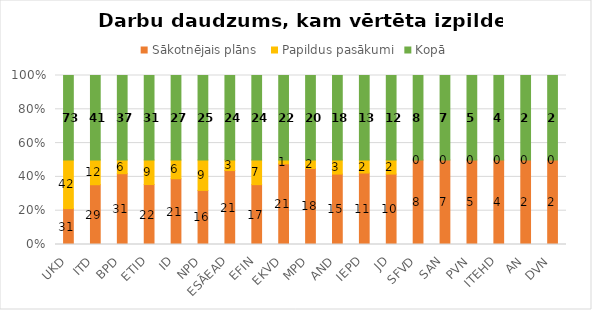
| Category | Sākotnējais plāns  | Papildus pasākumi | Kopā |
|---|---|---|---|
| UKD | 31 | 42 | 73 |
| ITD | 29 | 12 | 41 |
| BPD | 31 | 6 | 37 |
| ETID | 22 | 9 | 31 |
| ID | 21 | 6 | 27 |
| NPD | 16 | 9 | 25 |
| ESĀEAD | 21 | 3 | 24 |
| EFIN | 17 | 7 | 24 |
| EKVD | 21 | 1 | 22 |
| MPD | 18 | 2 | 20 |
| AND | 15 | 3 | 18 |
| IEPD | 11 | 2 | 13 |
| JD | 10 | 2 | 12 |
| SFVD | 8 | 0 | 8 |
| SAN | 7 | 0 | 7 |
| PVN | 5 | 0 | 5 |
| ITEHD | 4 | 0 | 4 |
| AN | 2 | 0 | 2 |
| DVN | 2 | 0 | 2 |